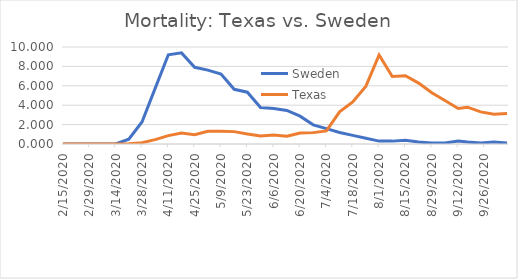
| Category | Sweden | Texas |
|---|---|---|
| 2/15/20 | 0 | 0 |
| 2/22/20 | 0 | 0 |
| 2/29/20 | 0 | 0 |
| 3/7/20 | 0 | 0 |
| 3/14/20 | 0 | 0 |
| 3/21/20 | 0.494 | 0.034 |
| 3/28/20 | 2.274 | 0.138 |
| 4/4/20 | 5.735 | 0.448 |
| 4/11/20 | 9.196 | 0.862 |
| 4/18/20 | 9.394 | 1.138 |
| 4/25/20 | 7.911 | 0.966 |
| 5/2/20 | 7.614 | 1.311 |
| 5/9/20 | 7.218 | 1.311 |
| 5/16/20 | 5.636 | 1.276 |
| 5/23/20 | 5.34 | 1.035 |
| 5/30/20 | 3.758 | 0.828 |
| 6/6/20 | 3.659 | 0.931 |
| 6/13/20 | 3.461 | 0.793 |
| 6/20/20 | 2.868 | 1.138 |
| 6/27/20 | 1.978 | 1.173 |
| 7/4/20 | 1.582 | 1.345 |
| 7/11/20 | 1.187 | 3.311 |
| 7/18/20 | 0.89 | 4.345 |
| 7/25/20 | 0.593 | 5.966 |
| 8/1/20 | 0.297 | 9.174 |
| 8/8/20 | 0.297 | 6.966 |
| 8/15/20 | 0.396 | 7.035 |
| 8/22/20 | 0.198 | 6.277 |
| 8/29/20 | 0.099 | 5.277 |
| 9/5/20 | 0.099 | 4.483 |
| 9/12/20 | 0.297 | 3.656 |
| 9/17/20 | 0.198 | 3.794 |
| 9/24/20 | 0.099 | 3.311 |
| 10/1/20 | 0.198 | 3.069 |
| 10/8/20 | 0.099 | 3.138 |